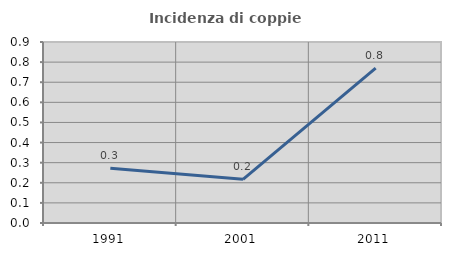
| Category | Incidenza di coppie miste |
|---|---|
| 1991.0 | 0.273 |
| 2001.0 | 0.217 |
| 2011.0 | 0.77 |